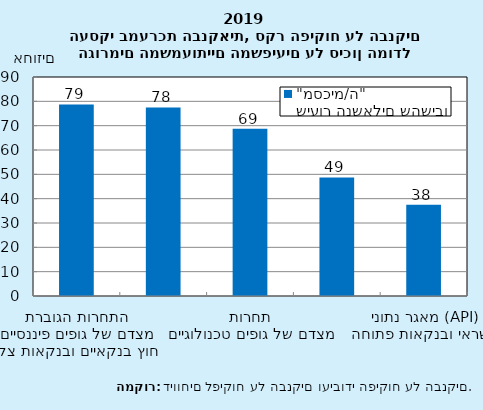
| Category | שיעור הנשאלים שהשיבו "מסכימ/ה" |
|---|---|
| התחרות הגוברת מצדם של גופים פיננסיים חוץ בנקאיים ובנקאות צל | 78.75 |
| שינויים טכנולוגיים מחוללי תחרות | 77.5 |
| תחרות מצדם של גופים טכנולוגיים | 68.75 |
| שינויים מבניים בענף הבנקאות | 48.75 |
| מאגר נתוני אשראי ובנקאות פתוחה (API) | 37.5 |